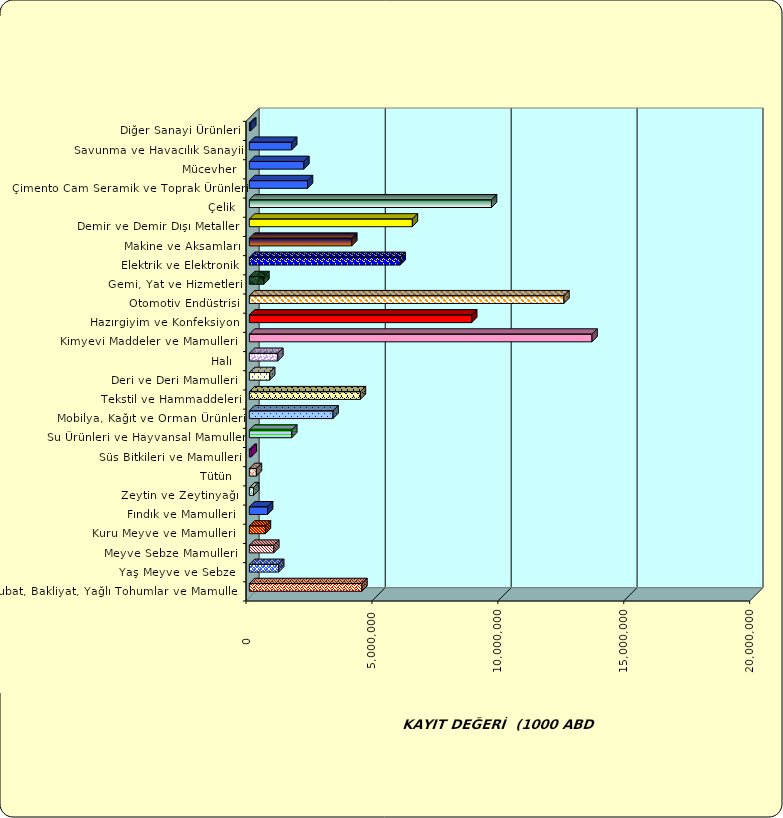
| Category | Series 0 |
|---|---|
|  Hububat, Bakliyat, Yağlı Tohumlar ve Mamulleri  | 4469885.845 |
|  Yaş Meyve ve Sebze   | 1164336.028 |
|  Meyve Sebze Mamulleri  | 970739.172 |
|  Kuru Meyve ve Mamulleri   | 637075.477 |
|  Fındık ve Mamulleri  | 723575.71 |
|  Zeytin ve Zeytinyağı  | 167316.64 |
|  Tütün  | 280057.446 |
|  Süs Bitkileri ve Mamulleri | 75667.615 |
|  Su Ürünleri ve Hayvansal Mamuller | 1683762.434 |
|  Mobilya, Kağıt ve Orman Ürünleri | 3322607.601 |
|  Tekstil ve Hammaddeleri | 4409456.228 |
|  Deri ve Deri Mamulleri  | 806663.374 |
|  Halı  | 1130219.446 |
|  Kimyevi Maddeler ve Mamulleri   | 13606573.623 |
|  Hazırgiyim ve Konfeksiyon  | 8827352.611 |
|  Otomotiv Endüstrisi | 12491358.434 |
|  Gemi, Yat ve Hizmetleri | 577085.999 |
|  Elektrik ve Elektronik | 5991200.113 |
|  Makine ve Aksamları | 4067446.941 |
|  Demir ve Demir Dışı Metaller  | 6472886.297 |
|  Çelik | 9615123.27 |
|  Çimento Cam Seramik ve Toprak Ürünleri | 2309367.785 |
|  Mücevher | 2163937.525 |
|  Savunma ve Havacılık Sanayii | 1680747.441 |
|  Diğer Sanayi Ürünleri | 54574.042 |